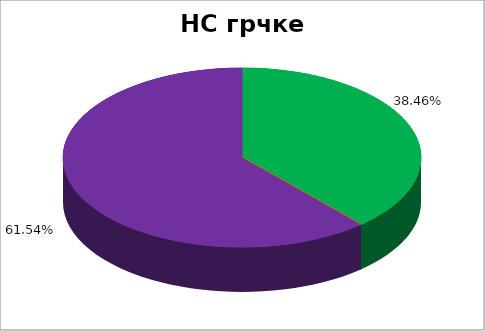
| Category | НС грчке НМ |
|---|---|
| 0 | 0.385 |
| 1 | 0 |
| 2 | 0 |
| 3 | 0 |
| 4 | 0.615 |